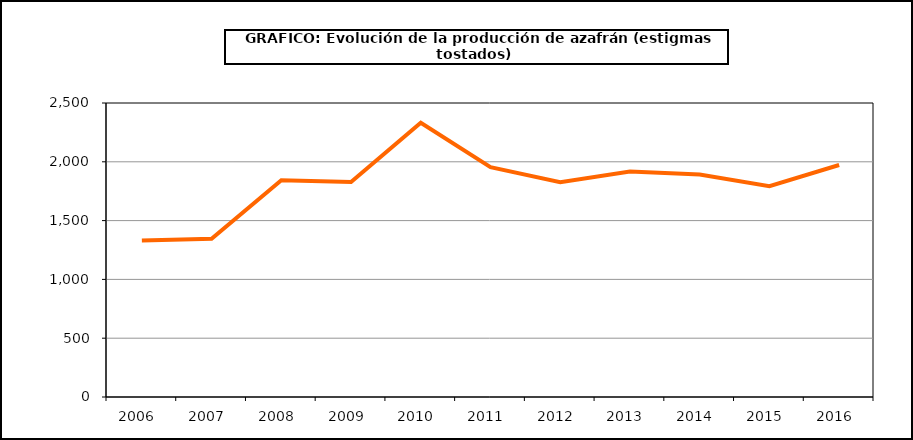
| Category | Producción |
|---|---|
| 2006.0 | 1330 |
| 2007.0 | 1345 |
| 2008.0 | 1843 |
| 2009.0 | 1829 |
| 2010.0 | 2332 |
| 2011.0 | 1954 |
| 2012.0 | 1827 |
| 2013.0 | 1918 |
| 2014.0 | 1892 |
| 2015.0 | 1793 |
| 2016.0 | 1973 |